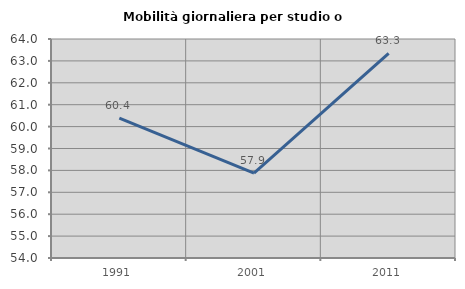
| Category | Mobilità giornaliera per studio o lavoro |
|---|---|
| 1991.0 | 60.385 |
| 2001.0 | 57.88 |
| 2011.0 | 63.34 |